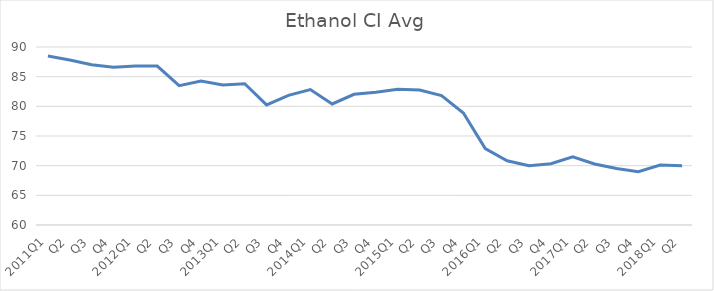
| Category | Series 0 |
|---|---|
| 2011Q1 | 88.48 |
| Q2 | 87.8 |
| Q3 | 87 |
| Q4 | 86.6 |
| 2012Q1 | 86.8 |
| Q2 | 86.78 |
| Q3 | 83.48 |
| Q4 | 84.27 |
| 2013Q1 | 83.6 |
| Q2 | 83.81 |
| Q3 | 80.24 |
| Q4 | 81.84 |
| 2014Q1 | 82.83 |
| Q2 | 80.4 |
| Q3 | 82.03 |
| Q4 | 82.38 |
| 2015Q1 | 82.86 |
| Q2 | 82.75 |
| Q3 | 81.8 |
| Q4 | 78.87 |
| 2016Q1 | 72.87 |
| Q2 | 70.83 |
| Q3 | 69.98 |
| Q4 | 70.34 |
| 2017Q1 | 71.49 |
| Q2 | 70.29 |
| Q3 | 69.51 |
| Q4 | 68.98 |
| 2018Q1 | 70.11 |
| Q2 | 70 |